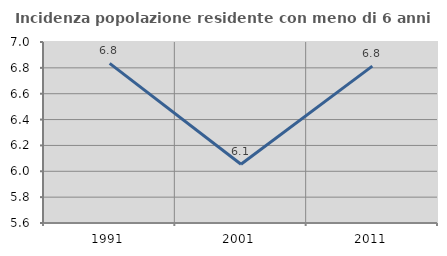
| Category | Incidenza popolazione residente con meno di 6 anni |
|---|---|
| 1991.0 | 6.835 |
| 2001.0 | 6.054 |
| 2011.0 | 6.814 |